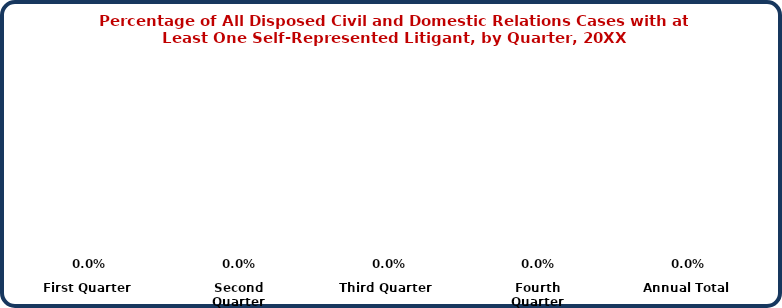
| Category | Civil and Domestic Relations |
|---|---|
| First Quarter | 0 |
| Second Quarter | 0 |
| Third Quarter | 0 |
| Fourth Quarter | 0 |
| Annual Total | 0 |